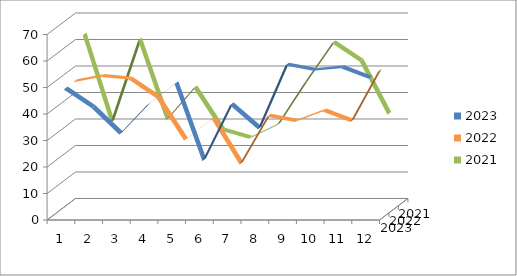
| Category | 2023 | 2022 | 2021 |
|---|---|---|---|
| 0 | 48 | 48 | 63 |
| 1 | 41 | 50 | 30 |
| 2 | 31 | 49 | 61 |
| 3 | 42 | 42 | 31 |
| 4 | 50 | 26 | 43 |
| 5 | 21 | 34 | 27 |
| 6 | 42 | 17 | 24 |
| 7 | 33 | 35 | 29 |
| 8 | 57 | 33 | 45 |
| 9 | 55 | 37 | 60 |
| 10 | 56 | 33 | 53 |
| 11 | 52 | 52 | 33 |